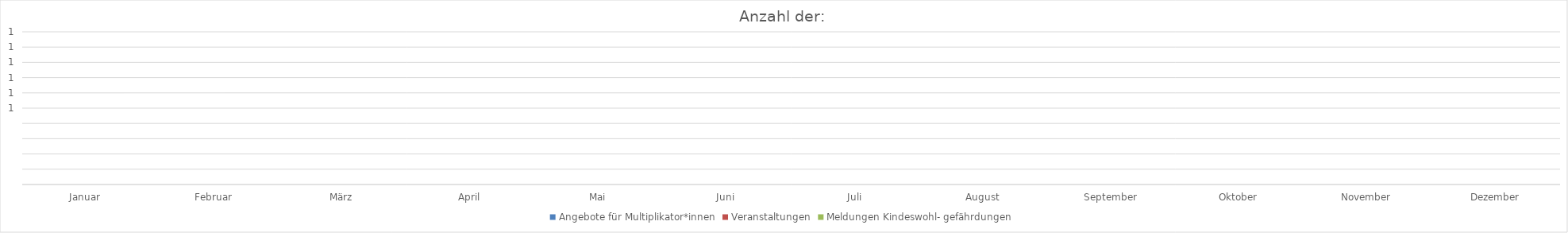
| Category | Angebote für Multiplikator*innen | Veranstaltungen | Meldungen Kindeswohl- gefährdungen  |
|---|---|---|---|
| Januar | 0 | 0 | 0 |
| Februar | 0 | 0 | 0 |
| März | 0 | 0 | 0 |
| April | 0 | 0 | 0 |
| Mai | 0 | 0 | 0 |
| Juni | 0 | 0 | 0 |
| Juli | 0 | 0 | 0 |
| August | 0 | 0 | 0 |
| September | 0 | 0 | 0 |
| Oktober | 0 | 0 | 0 |
| November | 0 | 0 | 0 |
| Dezember | 0 | 0 | 0 |